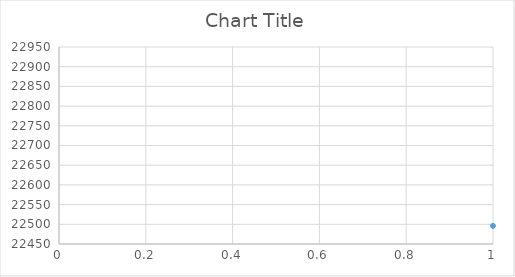
| Category | Series 0 |
|---|---|
| 0 | 22496 |
| 1 | 22548 |
| 2 | 22583 |
| 3 | 22617 |
| 4 | 22783 |
| 5 | 22831 |
| 6 | 22846 |
| 7 | 22860 |
| 8 | 22881 |